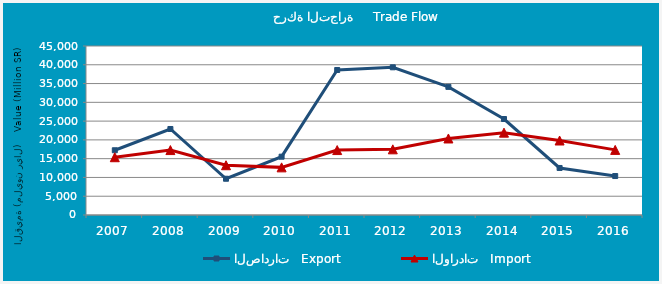
| Category | الصادرات   Export | الواردات   Import |
|---|---|---|
| 2007.0 | 17239.17 | 15381.414 |
| 2008.0 | 22901.994 | 17288.491 |
| 2009.0 | 9653.082 | 13250.192 |
| 2010.0 | 15529.208 | 12681.714 |
| 2011.0 | 38611.128 | 17289.755 |
| 2012.0 | 39325.603 | 17484.412 |
| 2013.0 | 34115.041 | 20374.074 |
| 2014.0 | 25560.311 | 21928.934 |
| 2015.0 | 12519.845 | 19834.714 |
| 2016.0 | 10375.107 | 17338.944 |